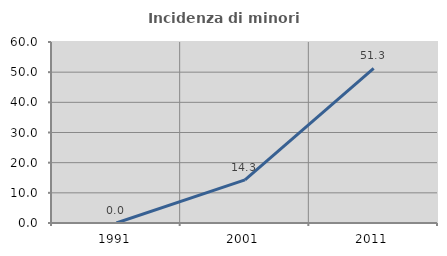
| Category | Incidenza di minori stranieri |
|---|---|
| 1991.0 | 0 |
| 2001.0 | 14.286 |
| 2011.0 | 51.282 |